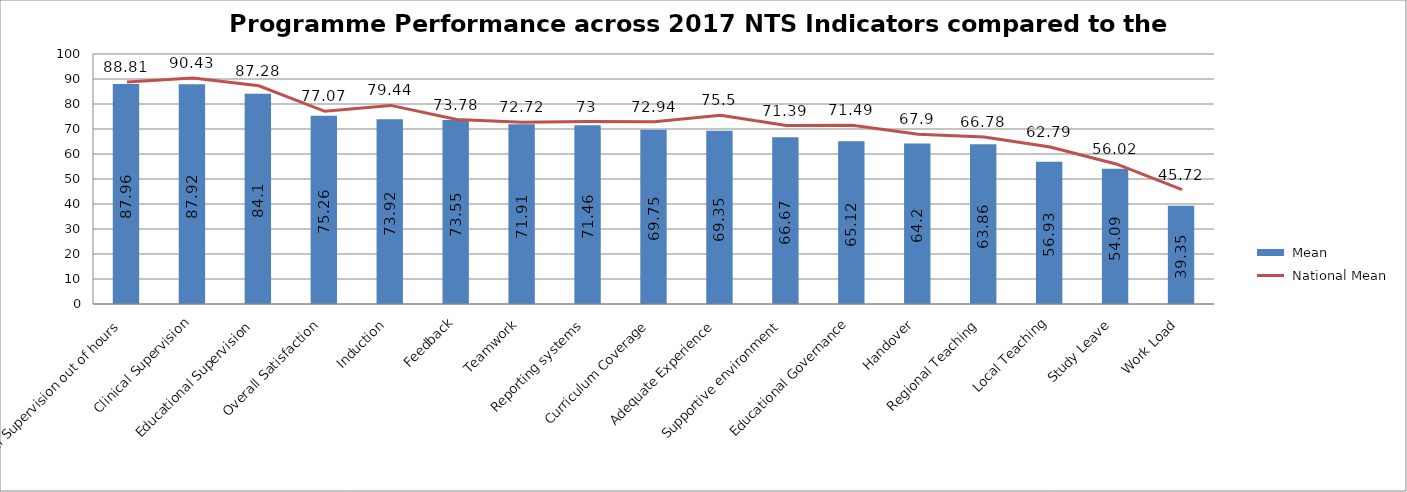
| Category |  Mean |
|---|---|
| Clinical Supervision out of hours | 87.96 |
| Clinical Supervision | 87.92 |
| Educational Supervision | 84.1 |
| Overall Satisfaction | 75.26 |
| Induction | 73.92 |
| Feedback | 73.55 |
| Teamwork | 71.91 |
| Reporting systems | 71.46 |
| Curriculum Coverage | 69.75 |
| Adequate Experience | 69.35 |
| Supportive environment | 66.67 |
| Educational Governance | 65.12 |
| Handover | 64.2 |
| Regional Teaching | 63.86 |
| Local Teaching | 56.93 |
| Study Leave | 54.09 |
| Work Load | 39.35 |